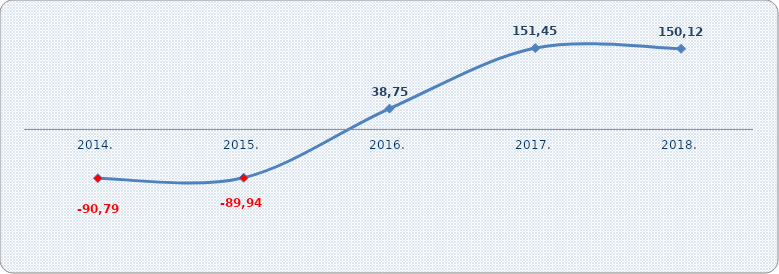
| Category | Dobit ili gubitak razdoblja  |
|---|---|
| 2014. | -90798.192 |
| 2015. | -89943.632 |
| 2016. | 38756.817 |
| 2017. | 151458.438 |
| 2018. | 150121.954 |